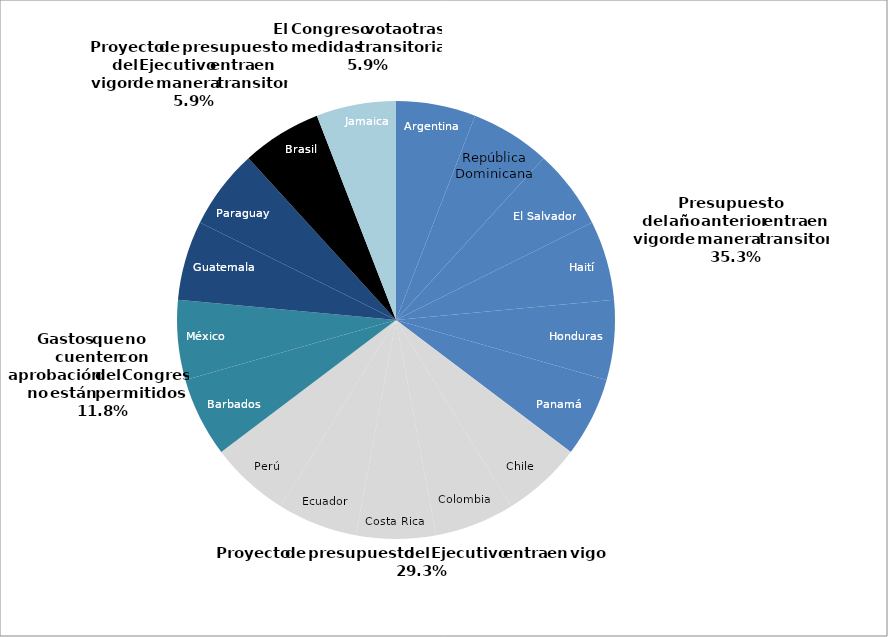
| Category | Series 0 |
|---|---|
| Argentina | 1 |
| Dominican Republic | 1 |
| El Salvador | 1 |
| Haiti | 1 |
| Honduras | 1 |
| Panama | 1 |
| Chile | 1 |
| Colombia | 1 |
| Costa Rica | 1 |
| Ecuador | 1 |
| Peru | 1 |
| Barbados | 1 |
| Mexico | 1 |
| Guatemala | 1 |
| Paraguay | 1 |
| Brazil | 1 |
| Jamaica | 1 |